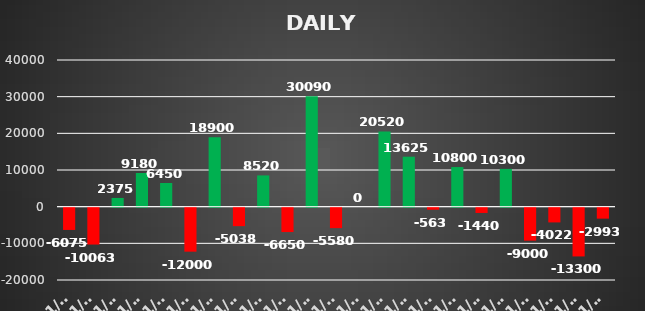
| Category | Series 0 |
|---|---|
| 2022-11-01 | -6075 |
| 2022-11-02 | -10062.5 |
| 2022-11-03 | 2375 |
| 2022-11-04 | 9180 |
| 2022-11-07 | 6450 |
| 2022-11-09 | -12000 |
| 2022-11-10 | 18900 |
| 2022-11-14 | -5037.5 |
| 2022-11-15 | 8520 |
| 2022-11-16 | -6650 |
| 2022-11-17 | 30090 |
| 2022-11-18 | -5580 |
| 2022-11-21 | 0 |
| 2022-11-22 | 20520 |
| 2022-11-23 | 13625 |
| 2022-11-24 | -562.5 |
| 2022-11-24 | 10800 |
| 2022-11-25 | -1440 |
| 2022-11-25 | 10300 |
| 2022-11-28 | -9000 |
| 2022-11-29 | -4022 |
| 2022-11-29 | -13300 |
| 2022-11-30 | -2992.5 |